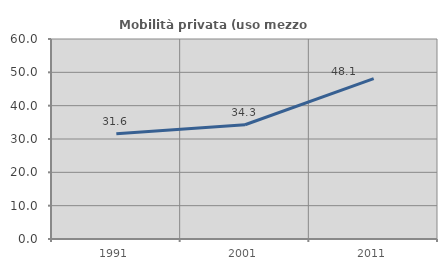
| Category | Mobilità privata (uso mezzo privato) |
|---|---|
| 1991.0 | 31.553 |
| 2001.0 | 34.286 |
| 2011.0 | 48.092 |